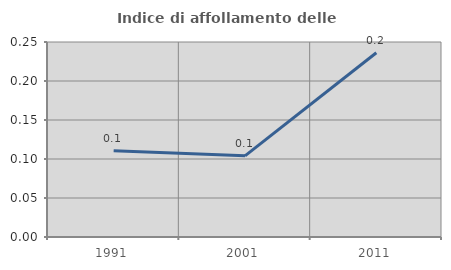
| Category | Indice di affollamento delle abitazioni  |
|---|---|
| 1991.0 | 0.11 |
| 2001.0 | 0.104 |
| 2011.0 | 0.236 |